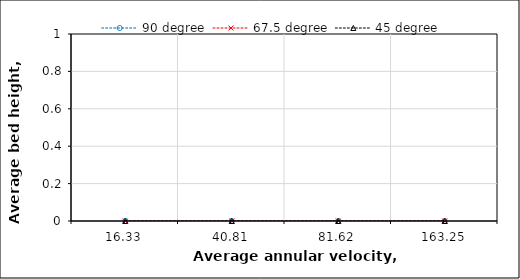
| Category | 90 degree | 67.5 degree | 45 degree |
|---|---|---|---|
| 16.33 | 0 | 0 | 0 |
| 40.81 | 0 | 0 | 0 |
| 81.62 | 0 | 0 | 0 |
| 163.25 | 0 | 0 | 0 |